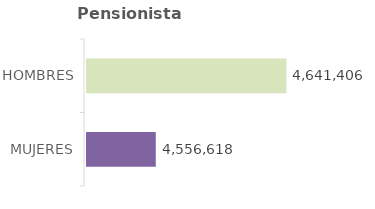
| Category | Series 0 | Series 1 |
|---|---|---|
| MUJERES | 4556618 |  |
| HOMBRES | 4641406 |  |